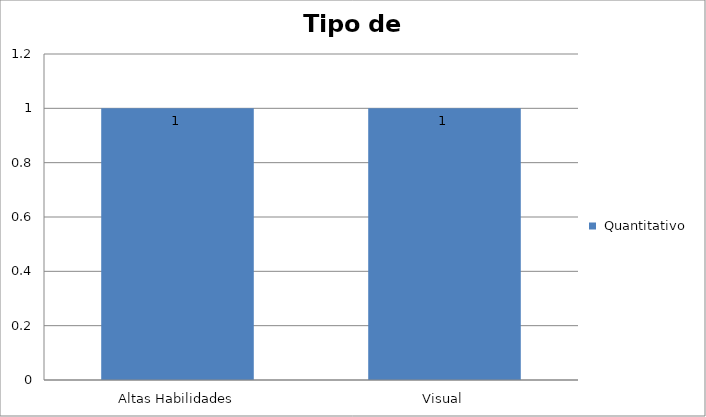
| Category |  Quantitativo |
|---|---|
| Altas Habilidades | 1 |
| Visual | 1 |